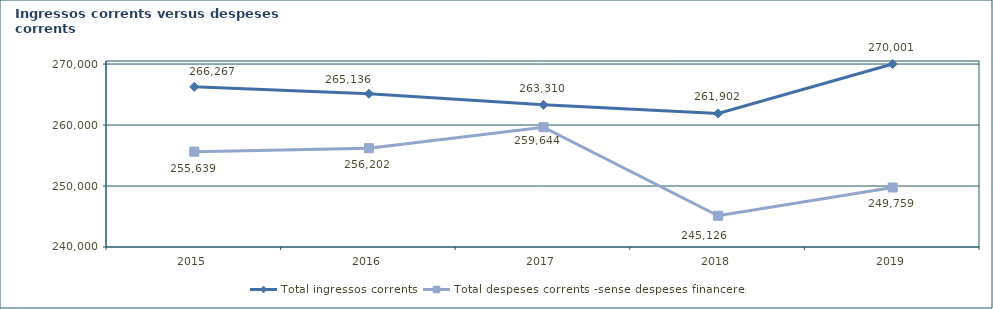
| Category | Total ingressos corrents  | Total despeses corrents -sense despeses financeres- |
|---|---|---|
| 2015.0 | 266267.248 | 255638.685 |
| 2016.0 | 265135.759 | 256201.94 |
| 2017.0 | 263309.601 | 259643.941 |
| 2018.0 | 261902.15 | 245126.06 |
| 2019.0 | 270000.624 | 249759.263 |